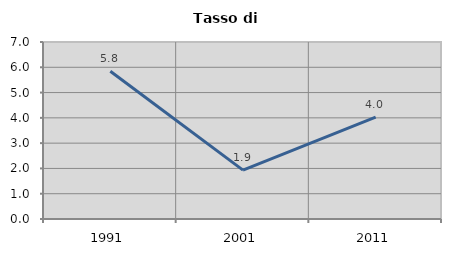
| Category | Tasso di disoccupazione   |
|---|---|
| 1991.0 | 5.842 |
| 2001.0 | 1.934 |
| 2011.0 | 4.03 |